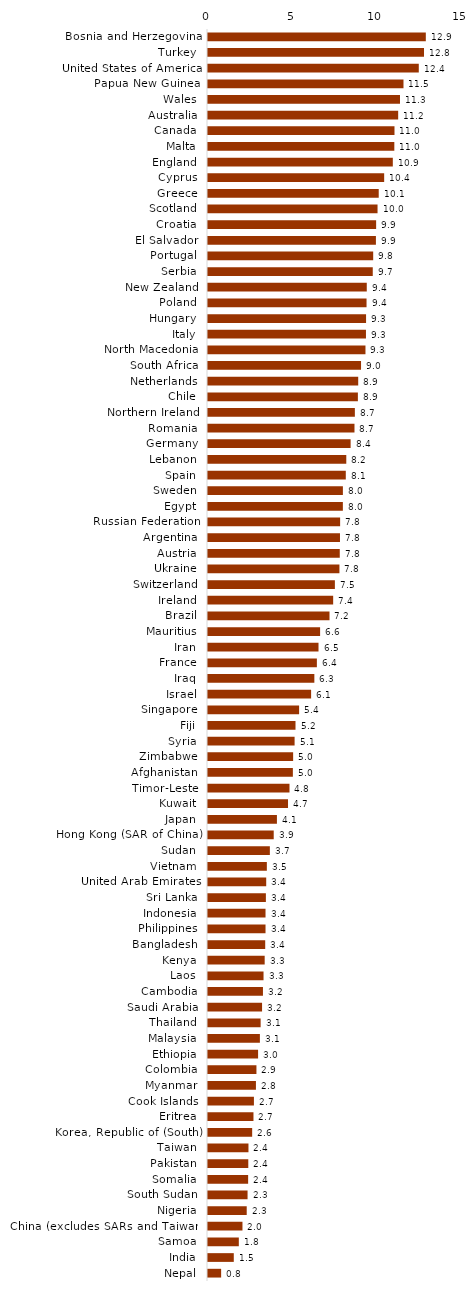
| Category | Series 0 |
|---|---|
| Bosnia and Herzegovina | 12.863 |
| Turkey | 12.756 |
| United States of America | 12.448 |
| Papua New Guinea | 11.544 |
| Wales | 11.338 |
| Australia | 11.231 |
| Canada | 11.013 |
| Malta | 11.004 |
| England | 10.914 |
| Cyprus | 10.404 |
| Greece | 10.082 |
| Scotland | 10.012 |
| Croatia | 9.929 |
| El Salvador | 9.916 |
| Portugal | 9.755 |
| Serbia | 9.73 |
| New Zealand | 9.376 |
| Poland | 9.363 |
| Hungary | 9.335 |
| Italy | 9.329 |
| North Macedonia | 9.3 |
| South Africa | 9.038 |
| Netherlands | 8.871 |
| Chile | 8.851 |
| Northern Ireland | 8.673 |
| Romania | 8.65 |
| Germany | 8.422 |
| Lebanon | 8.167 |
| Spain | 8.137 |
| Sweden | 7.966 |
| Egypt | 7.964 |
| Russian Federation | 7.803 |
| Argentina | 7.794 |
| Austria | 7.781 |
| Ukraine | 7.762 |
| Switzerland | 7.493 |
| Ireland | 7.392 |
| Brazil | 7.175 |
| Mauritius | 6.62 |
| Iran | 6.526 |
| France | 6.429 |
| Iraq | 6.281 |
| Israel | 6.089 |
| Singapore | 5.381 |
| Fiji | 5.168 |
| Syria | 5.114 |
| Zimbabwe | 5.028 |
| Afghanistan | 5.012 |
| Timor-Leste | 4.812 |
| Kuwait | 4.725 |
| Japan | 4.07 |
| Hong Kong (SAR of China) | 3.881 |
| Sudan | 3.653 |
| Vietnam | 3.475 |
| United Arab Emirates | 3.438 |
| Sri Lanka | 3.418 |
| Indonesia | 3.397 |
| Philippines | 3.397 |
| Bangladesh | 3.379 |
| Kenya | 3.347 |
| Laos | 3.279 |
| Cambodia | 3.245 |
| Saudi Arabia | 3.193 |
| Thailand | 3.108 |
| Malaysia | 3.065 |
| Ethiopia | 2.958 |
| Colombia | 2.861 |
| Myanmar | 2.831 |
| Cook Islands | 2.712 |
| Eritrea | 2.685 |
| Korea, Republic of (South) | 2.608 |
| Taiwan | 2.39 |
| Pakistan | 2.379 |
| Somalia | 2.37 |
| South Sudan | 2.336 |
| Nigeria | 2.287 |
| China (excludes SARs and Taiwan) | 2.035 |
| Samoa | 1.82 |
| India | 1.522 |
| Nepal | 0.776 |